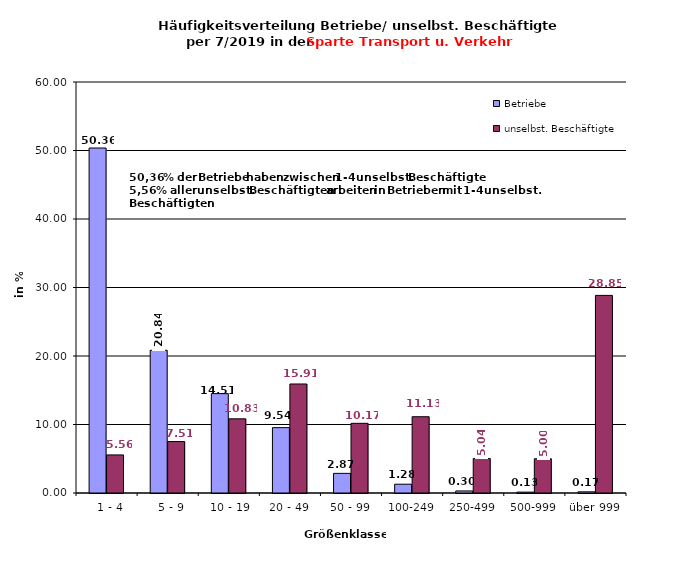
| Category | Betriebe | unselbst. Beschäftigte |
|---|---|---|
|   1 - 4 | 50.364 | 5.558 |
|   5 - 9 | 20.839 | 7.509 |
|  10 - 19 | 14.506 | 10.827 |
| 20 - 49 | 9.542 | 15.913 |
| 50 - 99 | 2.867 | 10.171 |
| 100-249 | 1.284 | 11.135 |
| 250-499 | 0.3 | 5.041 |
| 500-999 | 0.128 | 4.999 |
| über 999 | 0.171 | 28.848 |